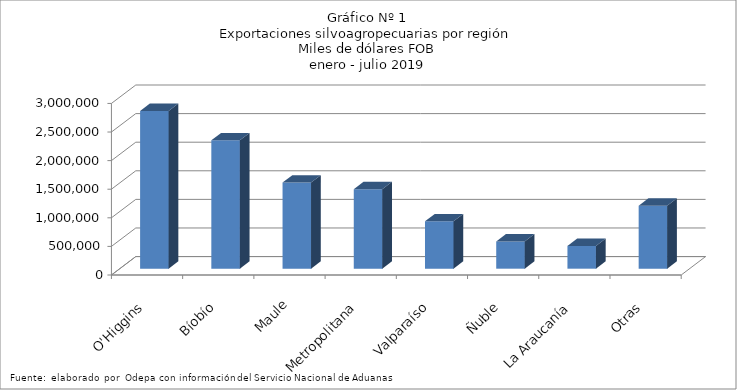
| Category | Series 0 |
|---|---|
| O'Higgins | 2759256.582 |
| Bíobío | 2245316.003 |
| Maule | 1505340.582 |
| Metropolitana | 1391136.291 |
| Valparaíso | 829132.684 |
| Ñuble | 475517.269 |
| La Araucanía | 398716.865 |
| Otras | 1101347.449 |